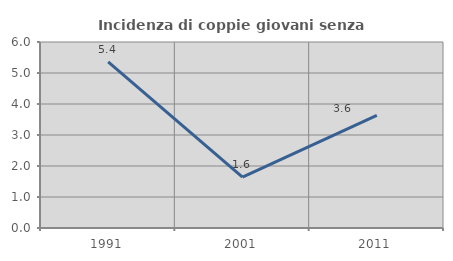
| Category | Incidenza di coppie giovani senza figli |
|---|---|
| 1991.0 | 5.357 |
| 2001.0 | 1.639 |
| 2011.0 | 3.636 |